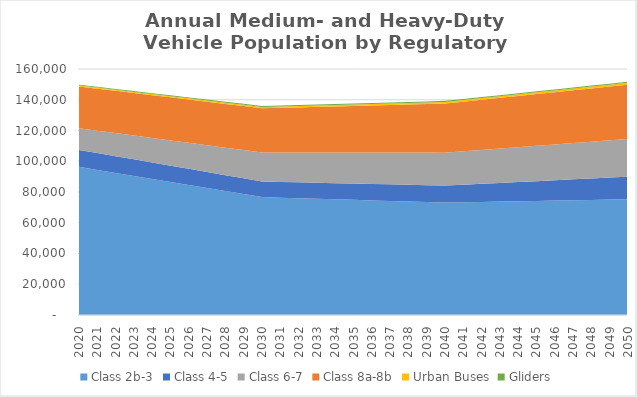
| Category | Class 2b-3 | Class 4-5 | Class 6-7 | Class 8a-8b | Urban Buses | Gliders |
|---|---|---|---|---|---|---|
| 2020.0 | 96360 | 11020 | 14090 | 27180 | 670 | 490 |
| 2021.0 | 94390 | 10930 | 14560 | 27340 | 690 | 510 |
| 2022.0 | 92430 | 10850 | 15030 | 27500 | 710 | 520 |
| 2023.0 | 90460 | 10760 | 15510 | 27660 | 720 | 540 |
| 2024.0 | 88500 | 10680 | 15980 | 27820 | 740 | 550 |
| 2025.0 | 86530 | 10590 | 16450 | 27980 | 760 | 570 |
| 2026.0 | 84560 | 10500 | 16920 | 28140 | 780 | 590 |
| 2027.0 | 82590 | 10410 | 17390 | 28300 | 800 | 600 |
| 2028.0 | 80630 | 10330 | 17870 | 28460 | 810 | 620 |
| 2029.0 | 78660 | 10240 | 18340 | 28620 | 830 | 630 |
| 2030.0 | 76690 | 10150 | 18810 | 28780 | 850 | 650 |
| 2031.0 | 76330 | 10240 | 19070 | 29100 | 870 | 650 |
| 2032.0 | 75970 | 10330 | 19330 | 29410 | 890 | 660 |
| 2033.0 | 75610 | 10430 | 19600 | 29730 | 910 | 660 |
| 2034.0 | 75250 | 10520 | 19860 | 30040 | 930 | 670 |
| 2035.0 | 74890 | 10610 | 20120 | 30360 | 950 | 670 |
| 2036.0 | 74530 | 10700 | 20380 | 30680 | 970 | 680 |
| 2037.0 | 74170 | 10800 | 20640 | 30990 | 990 | 680 |
| 2038.0 | 73810 | 10890 | 20910 | 31310 | 1000 | 690 |
| 2039.0 | 73450 | 10990 | 21170 | 31620 | 1020 | 690 |
| 2040.0 | 73090 | 11080 | 21430 | 31940 | 1040 | 700 |
| 2041.0 | 73310 | 11440 | 21740 | 32280 | 1060 | 690 |
| 2042.0 | 73530 | 11800 | 22050 | 32620 | 1080 | 690 |
| 2043.0 | 73740 | 12170 | 22370 | 32950 | 1090 | 680 |
| 2044.0 | 73960 | 12530 | 22680 | 33290 | 1110 | 680 |
| 2045.0 | 74180 | 12890 | 22990 | 33630 | 1130 | 670 |
| 2046.0 | 74400 | 13250 | 23300 | 33970 | 1150 | 660 |
| 2047.0 | 74620 | 13620 | 23610 | 34300 | 1170 | 660 |
| 2048.0 | 74840 | 13980 | 23920 | 34640 | 1180 | 650 |
| 2049.0 | 75060 | 14350 | 24230 | 34970 | 1200 | 650 |
| 2050.0 | 75280 | 14710 | 24540 | 35310 | 1220 | 640 |